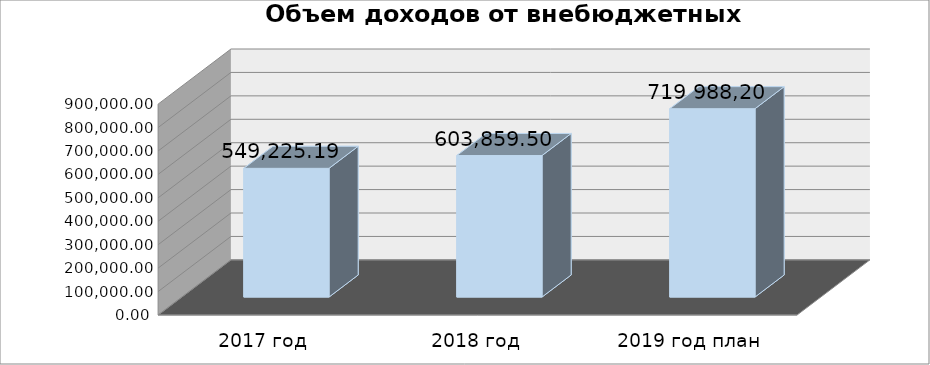
| Category | Series 0 |
|---|---|
| 2017 год | 549225.19 |
| 2018 год | 603859.5 |
| 2019 год план | 803770.14 |